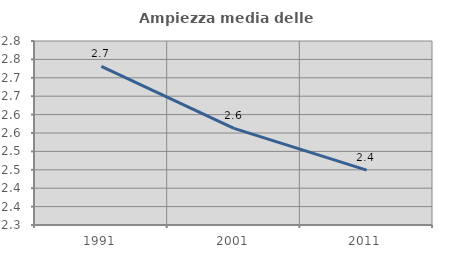
| Category | Ampiezza media delle famiglie |
|---|---|
| 1991.0 | 2.731 |
| 2001.0 | 2.563 |
| 2011.0 | 2.449 |